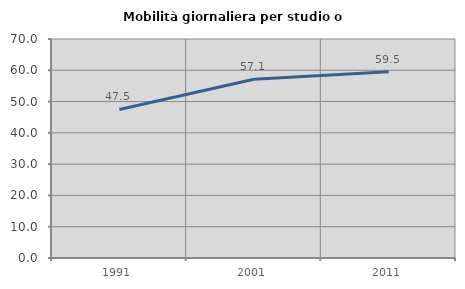
| Category | Mobilità giornaliera per studio o lavoro |
|---|---|
| 1991.0 | 47.467 |
| 2001.0 | 57.143 |
| 2011.0 | 59.511 |